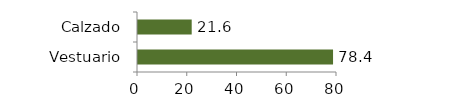
| Category | Vestuario y calzado |
|---|---|
| Vestuario | 78.41 |
| Calzado | 21.59 |